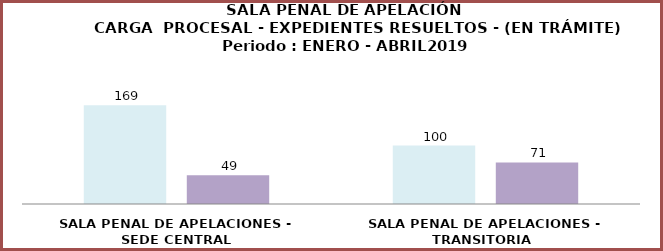
| Category | Series 0 | Series 1 |
|---|---|---|
| SALA PENAL DE APELACIONES - SEDE CENTRAL | 169 | 49 |
| SALA PENAL DE APELACIONES - TRANSITORIA  | 100 | 71 |